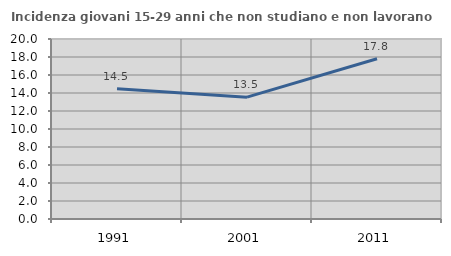
| Category | Incidenza giovani 15-29 anni che non studiano e non lavorano  |
|---|---|
| 1991.0 | 14.476 |
| 2001.0 | 13.538 |
| 2011.0 | 17.799 |